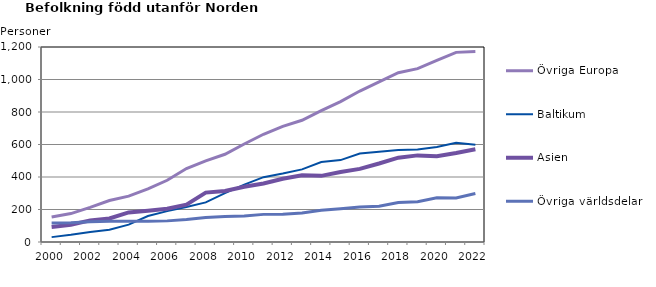
| Category | Övriga Europa | Baltikum | Asien | Övriga världsdelar |
|---|---|---|---|---|
| 2000 | 154 | 30 | 93 | 117 |
| 2001 | 175 | 44 | 106 | 118 |
| 2002 | 213 | 61 | 133 | 124 |
| 2003 | 255 | 76 | 145 | 128 |
| 2004 | 282 | 107 | 182 | 128 |
| 2005 | 327 | 160 | 193 | 127 |
| 2006 | 380 | 190 | 205 | 130 |
| 2007 | 452 | 216 | 230 | 138 |
| 2008 | 499 | 244 | 304 | 151 |
| 2009 | 540 | 301 | 314 | 157 |
| 2010 | 603 | 353 | 340 | 160 |
| 2011 | 663 | 399 | 360 | 170 |
| 2012 | 712 | 421 | 389 | 171 |
| 2013 | 749 | 447 | 411 | 178 |
| 2014 | 808 | 492 | 407 | 195 |
| 2015 | 864 | 504 | 431 | 205 |
| 2016 | 929 | 544 | 450 | 215 |
| 2017 | 985 | 556 | 483 | 220 |
| 2018 | 1042 | 566 | 519 | 243 |
| 2019 | 1067 | 569 | 533 | 248 |
| 2020 | 1117 | 585 | 528 | 272 |
| 2021 | 1167 | 610 | 548 | 271 |
| 2022 | 1173 | 599 | 571 | 298 |